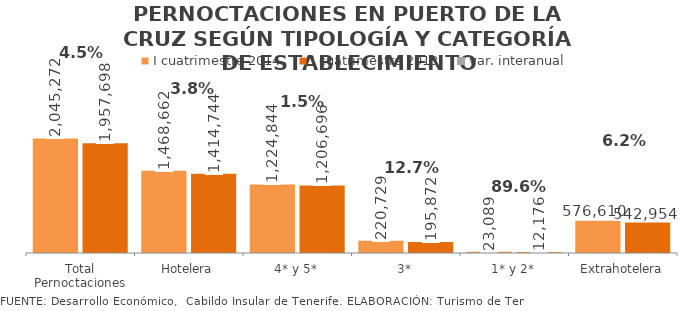
| Category | I cuatrimestre 2014 | I cuatrimestre 2013 |
|---|---|---|
| Total Pernoctaciones | 2045272 | 1957698 |
| Hotelera | 1468662 | 1414744 |
| 4* y 5* | 1224844 | 1206696 |
| 3* | 220729 | 195872 |
| 1* y 2* | 23089 | 12176 |
| Extrahotelera | 576610 | 542954 |